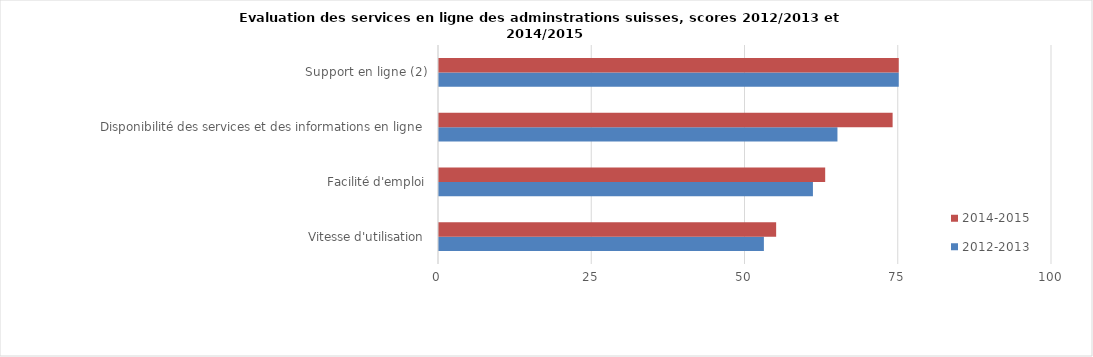
| Category | 2012-2013 | 2014-2015 |
|---|---|---|
| Vitesse d'utilisation | 53 | 55 |
| Facilité d'emploi | 61 | 63 |
| Disponibilité des services et des informations en ligne | 65 | 74 |
| Support en ligne (2) | 75 | 75 |